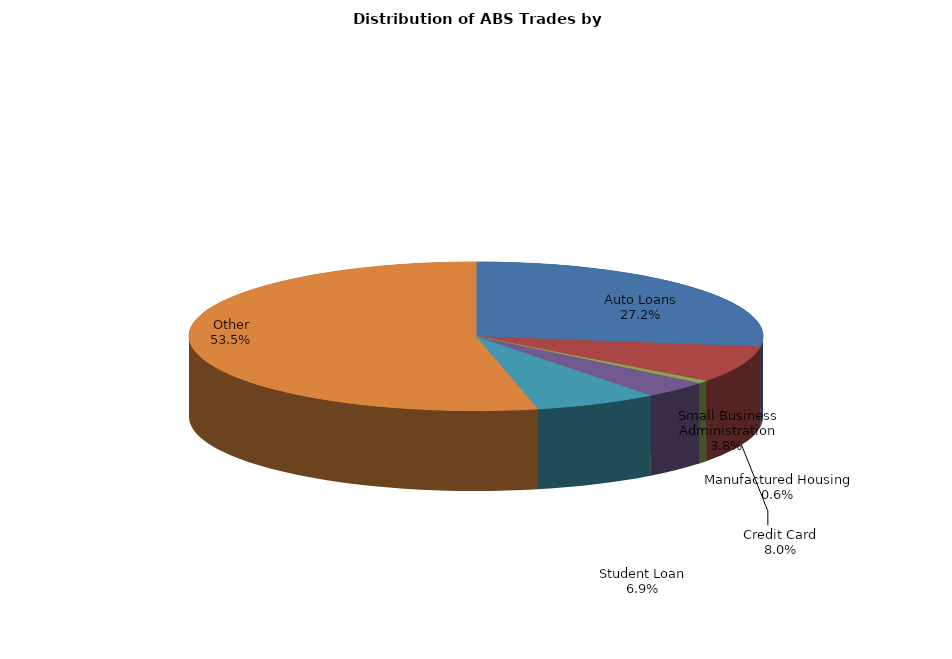
| Category | Series 0 |
|---|---|
| Auto Loans | 101.51 |
| Credit Card | 29.885 |
| Manufactured Housing | 2.324 |
| Small Business Administration | 14.126 |
| Student Loan | 25.885 |
| Other | 199.561 |